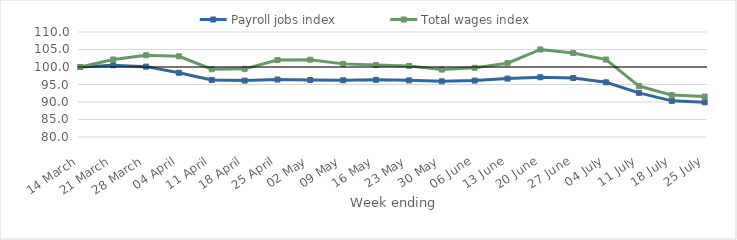
| Category | Payroll jobs index | Total wages index |
|---|---|---|
| 2020-03-14 | 100 | 100 |
| 2020-03-21 | 100.513 | 102.149 |
| 2020-03-28 | 100.103 | 103.366 |
| 2020-04-04 | 98.341 | 103.056 |
| 2020-04-11 | 96.312 | 99.357 |
| 2020-04-18 | 96.114 | 99.477 |
| 2020-04-25 | 96.419 | 101.982 |
| 2020-05-02 | 96.29 | 102.08 |
| 2020-05-09 | 96.213 | 100.893 |
| 2020-05-16 | 96.338 | 100.543 |
| 2020-05-23 | 96.183 | 100.299 |
| 2020-05-30 | 95.904 | 99.26 |
| 2020-06-06 | 96.119 | 99.777 |
| 2020-06-13 | 96.68 | 101.077 |
| 2020-06-20 | 97.075 | 105.012 |
| 2020-06-27 | 96.851 | 104.01 |
| 2020-07-04 | 95.623 | 102.133 |
| 2020-07-11 | 92.608 | 94.554 |
| 2020-07-18 | 90.325 | 91.966 |
| 2020-07-25 | 89.907 | 91.559 |